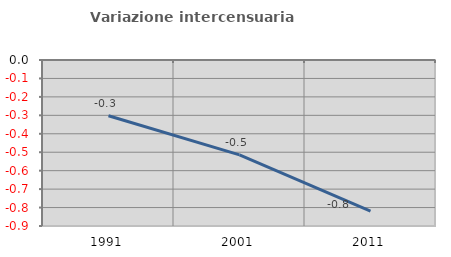
| Category | Variazione intercensuaria annua |
|---|---|
| 1991.0 | -0.302 |
| 2001.0 | -0.515 |
| 2011.0 | -0.819 |